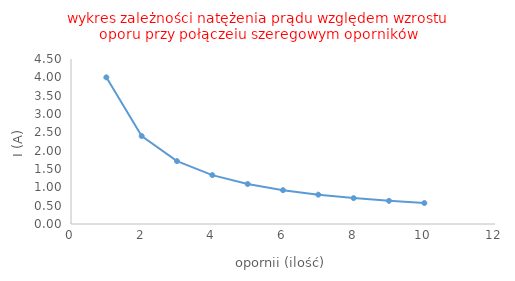
| Category | I (A) |
|---|---|
| 1.0 | 4 |
| 2.0 | 2.4 |
| 3.0 | 1.714 |
| 4.0 | 1.333 |
| 5.0 | 1.091 |
| 6.0 | 0.923 |
| 7.0 | 0.8 |
| 8.0 | 0.706 |
| 9.0 | 0.632 |
| 10.0 | 0.571 |